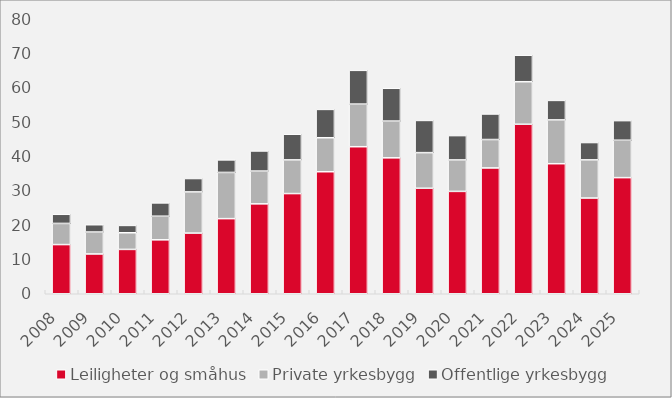
| Category | Leiligheter og småhus | Private yrkesbygg | Offentlige yrkesbygg |
|---|---|---|---|
| 2008.0 | 14.309 | 6.15 | 2.657 |
| 2009.0 | 11.578 | 6.379 | 2.124 |
| 2010.0 | 12.904 | 4.837 | 2.137 |
| 2011.0 | 15.687 | 6.87 | 3.87 |
| 2012.0 | 17.649 | 11.978 | 3.893 |
| 2013.0 | 21.853 | 13.438 | 3.648 |
| 2014.0 | 26.151 | 9.544 | 5.845 |
| 2015.0 | 29.143 | 9.801 | 7.464 |
| 2016.0 | 35.498 | 9.884 | 8.247 |
| 2017.0 | 42.774 | 12.402 | 9.819 |
| 2018.0 | 39.543 | 10.691 | 9.542 |
| 2019.0 | 30.691 | 10.36 | 9.368 |
| 2020.0 | 29.78 | 9.15 | 7.083 |
| 2021.0 | 36.606 | 8.259 | 7.434 |
| 2022.0 | 49.311 | 12.368 | 7.714 |
| 2023.0 | 37.829 | 12.746 | 5.673 |
| 2024.0 | 27.849 | 11.101 | 5.039 |
| 2025.0 | 33.781 | 10.879 | 5.707 |